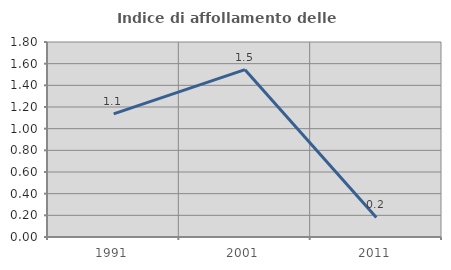
| Category | Indice di affollamento delle abitazioni  |
|---|---|
| 1991.0 | 1.136 |
| 2001.0 | 1.544 |
| 2011.0 | 0.18 |